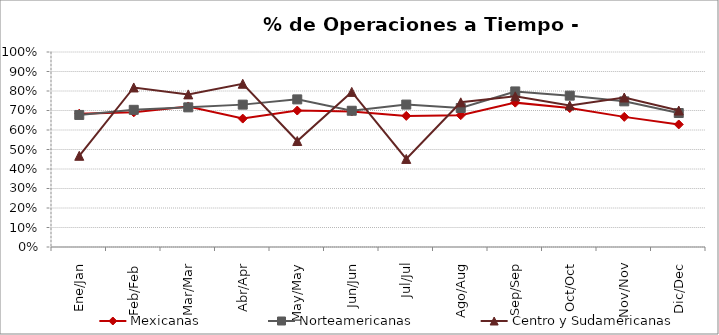
| Category | Mexicanas | Norteamericanas | Centro y Sudamericanas |
|---|---|---|---|
| Ene/Jan | 0.683 | 0.677 | 0.468 |
| Feb/Feb | 0.691 | 0.704 | 0.818 |
| Mar/Mar | 0.721 | 0.716 | 0.783 |
| Abr/Apr | 0.659 | 0.73 | 0.837 |
| May/May | 0.7 | 0.757 | 0.543 |
| Jun/Jun | 0.695 | 0.699 | 0.795 |
| Jul/Jul | 0.672 | 0.73 | 0.452 |
| Ago/Aug | 0.676 | 0.713 | 0.742 |
| Sep/Sep | 0.74 | 0.798 | 0.773 |
| Oct/Oct | 0.713 | 0.776 | 0.726 |
| Nov/Nov | 0.667 | 0.747 | 0.767 |
| Dic/Dec | 0.628 | 0.687 | 0.7 |